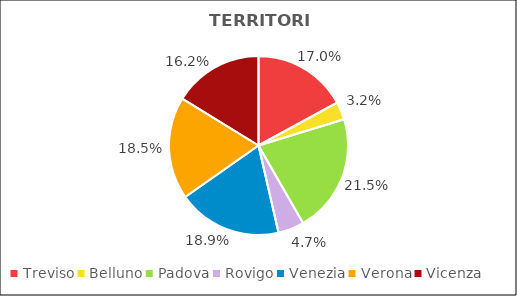
| Category | Series 0 |
|---|---|
| Treviso | 20120 |
| Belluno | 3822 |
| Padova | 25346 |
| Rovigo | 5550 |
| Venezia | 22278 |
| Verona | 21865 |
| Vicenza | 19200 |